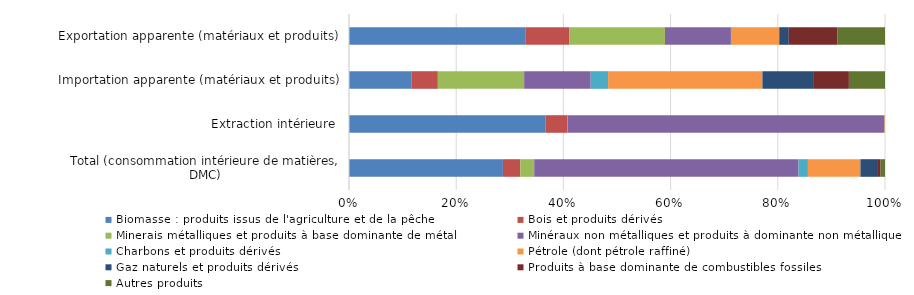
| Category | Biomasse : produits issus de l'agriculture et de la pêche | Bois et produits dérivés | Minerais métalliques et produits à base dominante de métal | Minéraux non métalliques et produits à dominante non métallique | Charbons et produits dérivés | Pétrole (dont pétrole raffiné) | Gaz naturels et produits dérivés | Produits à base dominante de combustibles fossiles | Autres produits |
|---|---|---|---|---|---|---|---|---|---|
| Total (consommation intérieure de matières, DMC) | 231.8 | 26.3 | 20.9 | 398.1 | 14.1 | 79.1 | 26.4 | 4 | 6.6 |
| Extraction intérieure  | 231.853 | 26.295 | 0.193 | 373.983 | 0 | 0.72 | 0.086 | 0 | 0 |
| Importation apparente (matériaux et produits) | 39.7 | 16.9 | 55 | 42.4 | 11.1 | 98.3 | 32.3 | 22.8 | 23 |
| Exportation apparente (matériaux et produits) | 66.5 | 16.7 | 36 | 24.9 | 0.026 | 18.2 | 3.6 | 18.3 | 18 |